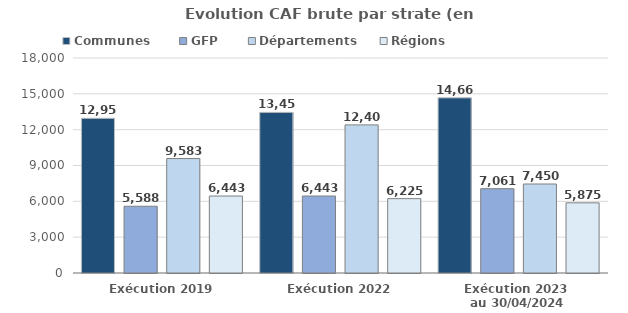
| Category | Communes  | GFP | Départements | Régions |
|---|---|---|---|---|
| Exécution 2019 | 12954.3 | 5588 | 9583 | 6443.1 |
| Exécution 2022 | 13449.9 | 6443.2 | 12401 | 6224.6 |
| Exécution 2023 
au 30/04/2024 | 14664.7 | 7061 | 7450.3 | 5874.8 |